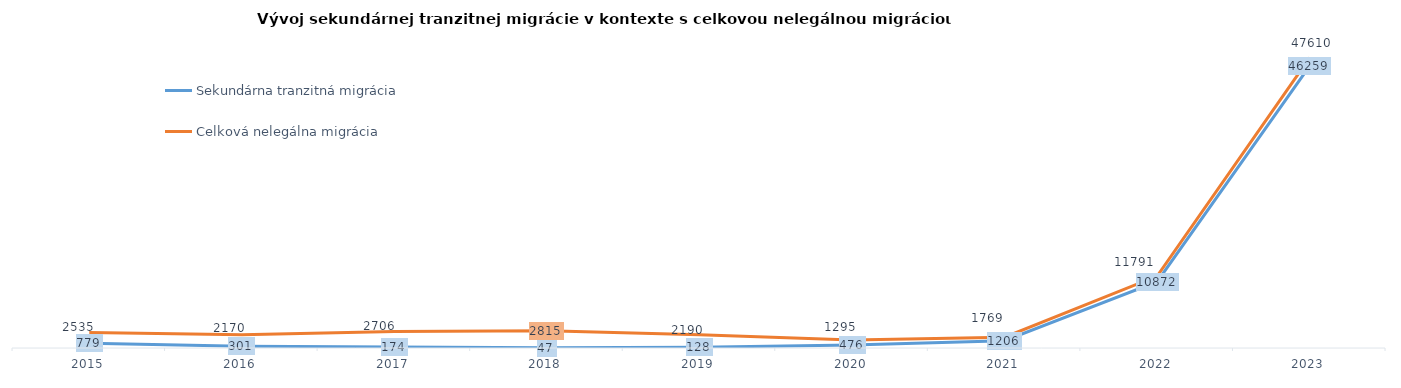
| Category | Sekundárna tranzitná migrácia | Celková nelegálna migrácia  |
|---|---|---|
| 2015.0 | 779 | 2535 |
| 2016.0 | 301 | 2170 |
| 2017.0 | 174 | 2706 |
| 2018.0 | 47 | 2815 |
| 2019.0 | 128 | 2190 |
| 2020.0 | 476 | 1295 |
| 2021.0 | 1206 | 1769 |
| 2022.0 | 10872 | 11791 |
| 2023.0 | 46259 | 47610 |